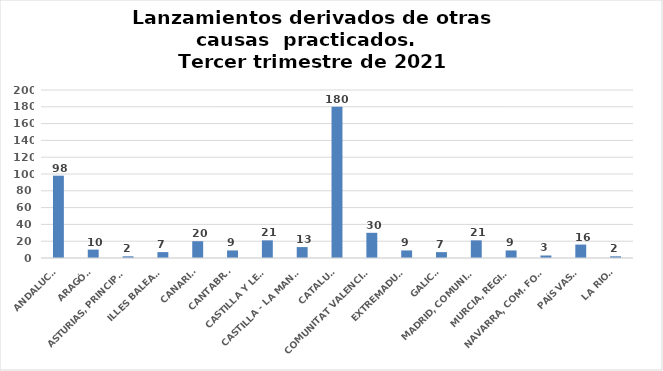
| Category | Series 0 |
|---|---|
| ANDALUCÍA | 98 |
| ARAGÓN | 10 |
| ASTURIAS, PRINCIPADO | 2 |
| ILLES BALEARS | 7 |
| CANARIAS | 20 |
| CANTABRIA | 9 |
| CASTILLA Y LEÓN | 21 |
| CASTILLA - LA MANCHA | 13 |
| CATALUÑA | 180 |
| COMUNITAT VALENCIANA | 30 |
| EXTREMADURA | 9 |
| GALICIA | 7 |
| MADRID, COMUNIDAD | 21 |
| MURCIA, REGIÓN | 9 |
| NAVARRA, COM. FORAL | 3 |
| PAÍS VASCO | 16 |
| LA RIOJA | 2 |